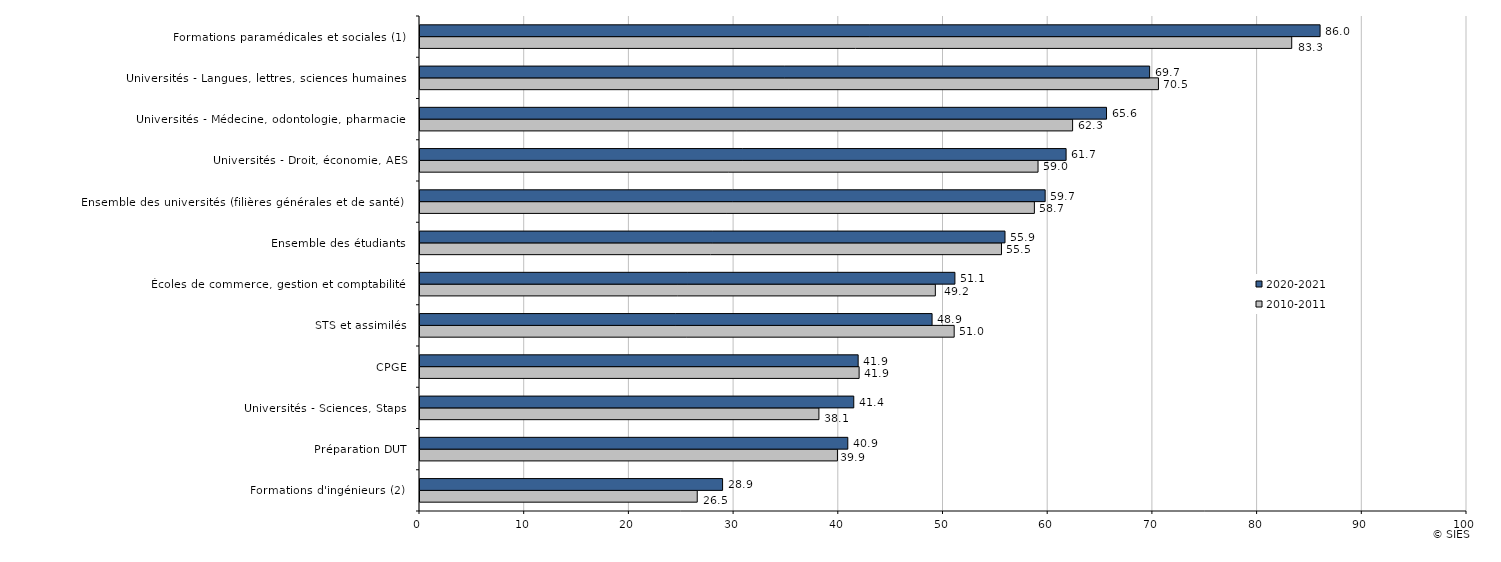
| Category | 2010-2011 | 2020-2021 |
|---|---|---|
| Formations d'ingénieurs (2) | 26.48 | 28.9 |
| Préparation DUT | 39.87 | 40.86 |
| Universités - Sciences, Staps | 38.1 | 41.43 |
| CPGE | 41.94 | 41.85 |
| STS et assimilés | 51.02 | 48.91 |
| Écoles de commerce, gestion et comptabilité | 49.22 | 51.09 |
| Ensemble des étudiants | 55.539 | 55.874 |
| Ensemble des universités (filières générales et de santé)  | 58.68 | 59.71 |
| Universités - Droit, économie, AES | 59.03 | 61.71 |
| Universités - Médecine, odontologie, pharmacie | 62.33 | 65.57 |
| Universités - Langues, lettres, sciences humaines | 70.53 | 69.69 |
| Formations paramédicales et sociales (1) | 83.26 | 85.97 |